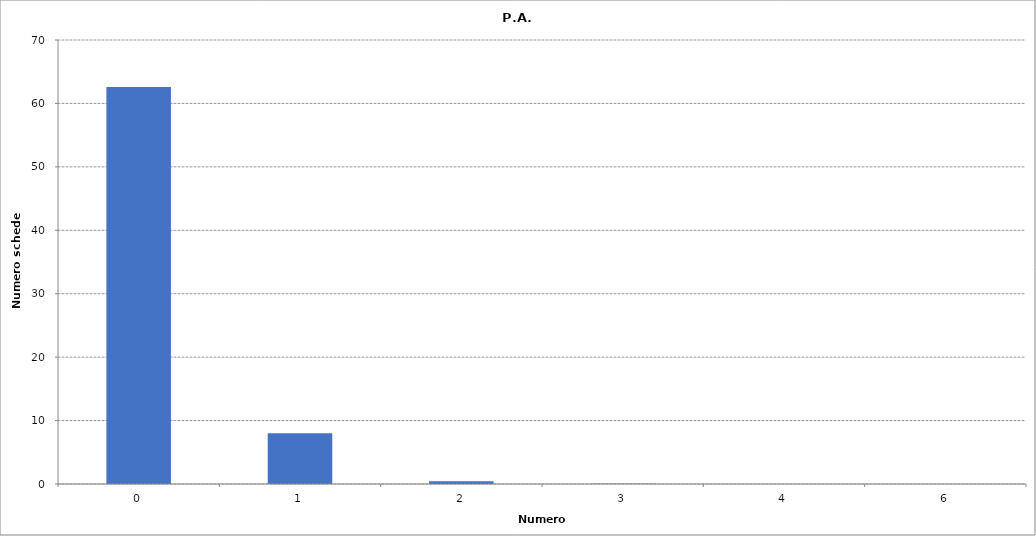
| Category | Series 0 |
|---|---|
| 0.0 | 62591 |
| 1.0 | 7996 |
| 2.0 | 440 |
| 3.0 | 32 |
| 4.0 | 3 |
| 6.0 | 1 |